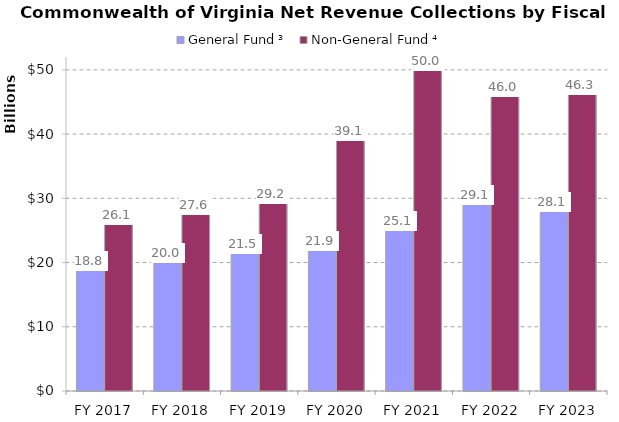
| Category | General Fund ³ | Non-General Fund ⁴ |
|---|---|---|
| FY 2017 | 18839827000 | 26073523000 |
| FY 2018 | 20024020000 | 27608806000 |
| FY 2019 | 21467094000 | 29225445000 |
| FY 2020 | 21903571000 | 39119584000 |
| FY 2021 | 25083803000 | 50027817000 |
| FY 2022 | 29109249000 | 45991135000 |
| FY 2023 | 28079312000 | 46256556000 |